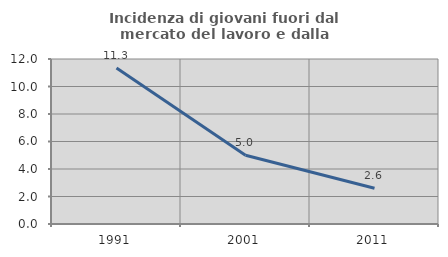
| Category | Incidenza di giovani fuori dal mercato del lavoro e dalla formazione  |
|---|---|
| 1991.0 | 11.34 |
| 2001.0 | 5 |
| 2011.0 | 2.597 |